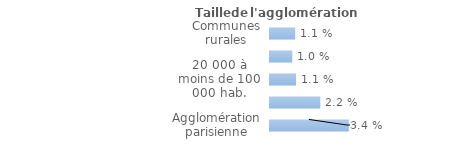
| Category | Series 0 |
|---|---|
| Communes rurales | 0.011 |
| moins de 20 000 hab. | 0.01 |
| 20 000 à moins de 100 000 hab. | 0.011 |
| 100 000 hab. ou plus | 0.022 |
| Agglomération parisienne | 0.034 |